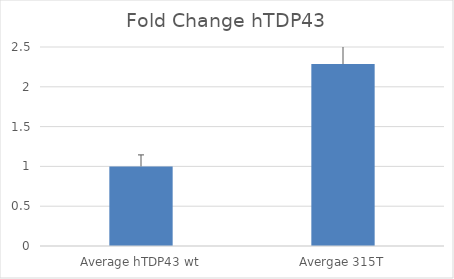
| Category | Series 0 |
|---|---|
| Average hTDP43 wt | 1 |
| Avergae 315T | 2.285 |